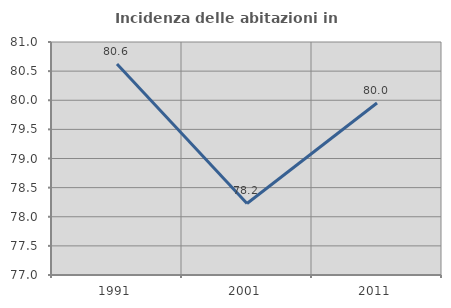
| Category | Incidenza delle abitazioni in proprietà  |
|---|---|
| 1991.0 | 80.621 |
| 2001.0 | 78.228 |
| 2011.0 | 79.953 |